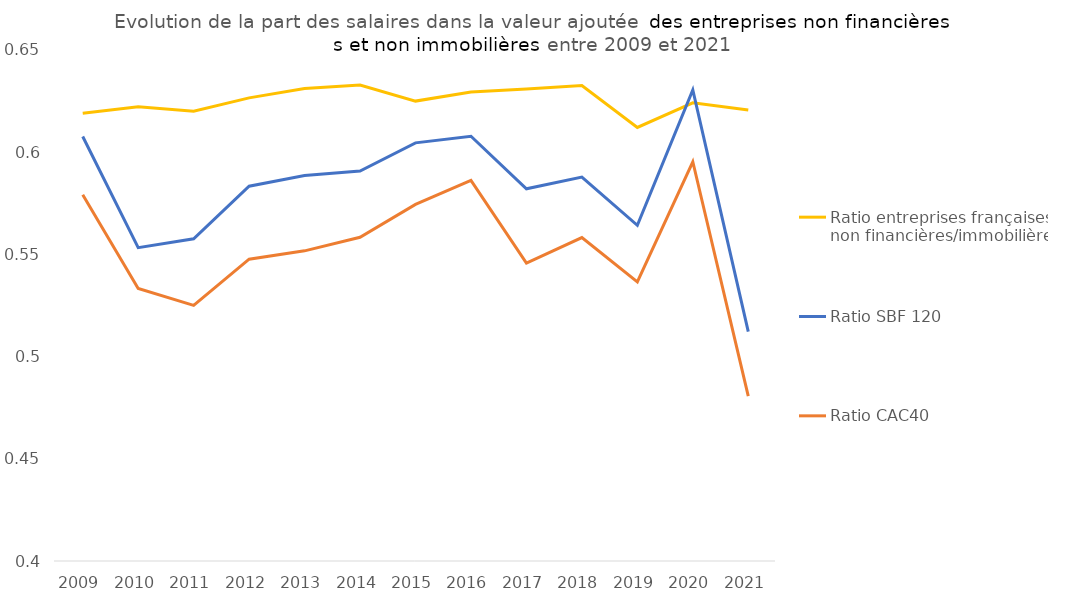
| Category | Ratio entreprises françaises
non financières/immobilières | Ratio SBF 120 | Ratio CAC40 |
|---|---|---|---|
| 2009.0 | 0.619 | 0.608 | 0.579 |
| 2010.0 | 0.622 | 0.553 | 0.533 |
| 2011.0 | 0.62 | 0.558 | 0.525 |
| 2012.0 | 0.627 | 0.583 | 0.548 |
| 2013.0 | 0.631 | 0.589 | 0.552 |
| 2014.0 | 0.633 | 0.591 | 0.558 |
| 2015.0 | 0.625 | 0.605 | 0.574 |
| 2016.0 | 0.629 | 0.608 | 0.586 |
| 2017.0 | 0.631 | 0.582 | 0.546 |
| 2018.0 | 0.633 | 0.588 | 0.558 |
| 2019.0 | 0.612 | 0.564 | 0.537 |
| 2020.0 | 0.624 | 0.63 | 0.595 |
| 2021.0 | 0.621 | 0.512 | 0.481 |